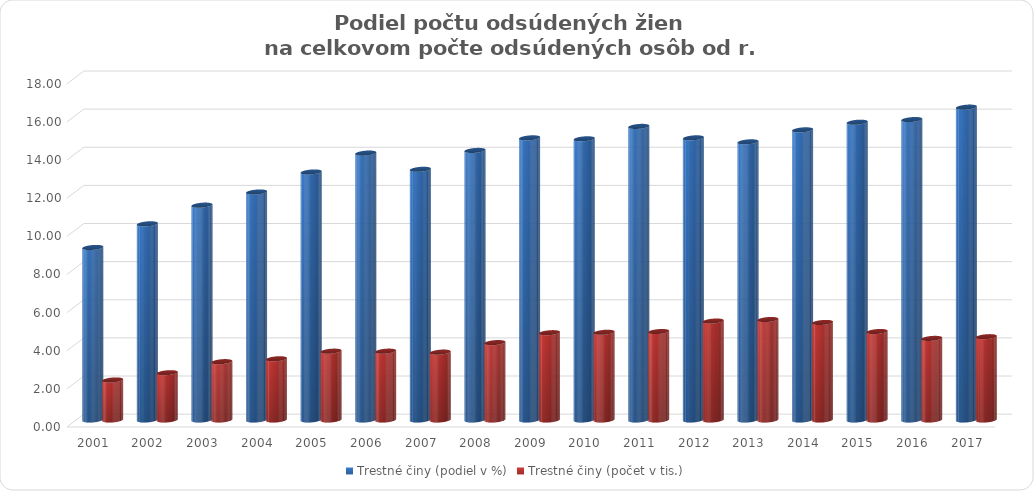
| Category | Trestné činy (podiel v %) | Trestné činy (počet v tis.) |
|---|---|---|
| 2001.0 | 9.05 | 2.1 |
| 2002.0 | 10.29 | 2.48 |
| 2003.0 | 11.27 | 3.06 |
| 2004.0 | 11.96 | 3.21 |
| 2005.0 | 13.01 | 3.61 |
| 2006.0 | 14 | 3.61 |
| 2007.0 | 13.15 | 3.56 |
| 2008.0 | 14.14 | 4.06 |
| 2009.0 | 14.8 | 4.58 |
| 2010.0 | 14.75 | 4.6 |
| 2011.0 | 15.4 | 4.64 |
| 2012.0 | 14.8 | 5.19 |
| 2013.0 | 14.59 | 5.27 |
| 2014.0 | 15.22 | 5.116 |
| 2015.0 | 15.62 | 4.64 |
| 2016.0 | 15.76 | 4.28 |
| 2017.0 | 16.41 | 4.37 |